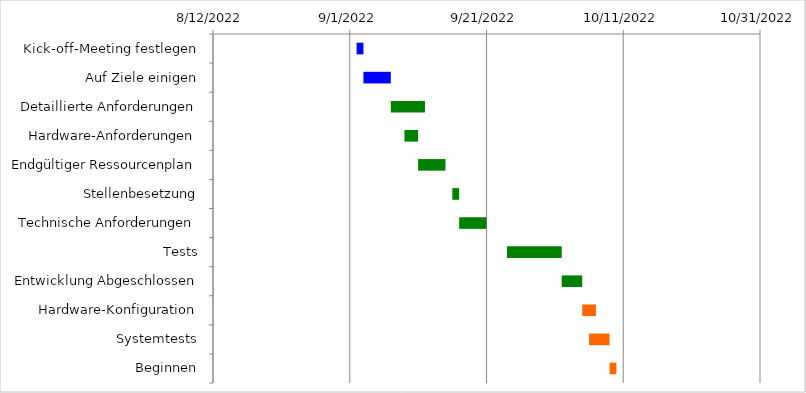
| Category | Beginn | Tage |
|---|---|---|
| Kick-off-Meeting festlegen | 9/2/22 | 1 |
| Auf Ziele einigen | 9/3/22 | 4 |
| Detaillierte Anforderungen | 9/7/22 | 5 |
| Hardware-Anforderungen | 9/9/22 | 2 |
| Endgültiger Ressourcenplan | 9/11/22 | 4 |
| Stellenbesetzung | 9/16/22 | 1 |
| Technische Anforderungen | 9/17/22 | 4 |
| Tests | 9/24/22 | 8 |
| Entwicklung Abgeschlossen | 10/2/22 | 3 |
| Hardware-Konfiguration | 10/5/22 | 2 |
| Systemtests | 10/6/22 | 3 |
| Beginnen | 10/9/22 | 1 |